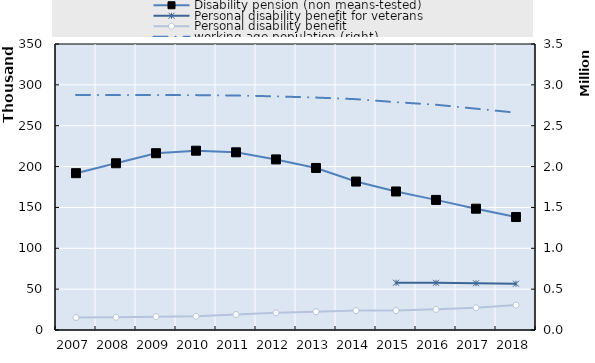
| Category | Disability pension (non means-tested) | Personal disability benefit for veterans | Personal disability benefit |
|---|---|---|---|
| 2007.0 | 191917 | 0 | 15223 |
| 2008.0 | 204046 | 0 | 15653 |
| 2009.0 | 216374 | 0 | 16332 |
| 2010.0 | 219432 | 0 | 16780 |
| 2011.0 | 217435 | 0 | 19027 |
| 2012.0 | 208767 | 0 | 21059 |
| 2013.0 | 198285 | 0 | 22362 |
| 2014.0 | 181663 | 0 | 23740 |
| 2015.0 | 169513 | 57859 | 23740 |
| 2016.0 | 159222 | 57758 | 25259 |
| 2017.0 | 148445 | 57205 | 27141 |
| 2018.0 | 138253 | 56621 | 30503 |